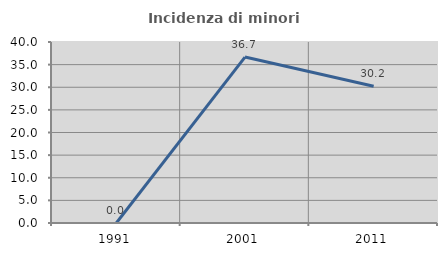
| Category | Incidenza di minori stranieri |
|---|---|
| 1991.0 | 0 |
| 2001.0 | 36.667 |
| 2011.0 | 30.233 |